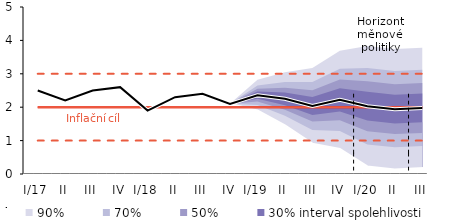
| Category | Inflation Target | Inflation Target - lower bound | Inflation Target - upper bound | linka | Střed předpovědi |
|---|---|---|---|---|---|
| I/17 | 2 | 1 | 3 | 2.5 | 2.5 |
| II | 2 | 1 | 3 | 2.2 | 2.2 |
| III | 2 | 1 | 3 | 2.5 | 2.5 |
| IV | 2 | 1 | 3 | 2.6 | 2.6 |
| I/18 | 2 | 1 | 3 | 1.9 | 1.9 |
| II | 2 | 1 | 3 | 2.3 | 2.3 |
| III | 2 | 1 | 3 | 2.4 | 2.4 |
| IV | 2 | 1 | 3 | 2.1 | 2.1 |
| I/19 | 2 | 1 | 3 | 2.359 | 2.359 |
| II | 2 | 1 | 3 | 2.251 | 2.251 |
| III | 2 | 1 | 3 | 2.039 | 2.039 |
| IV | 2 | 1 | 3 | 2.22 | 2.22 |
| I/20 | 2 | 1 | 3 | 2.031 | 2.031 |
| II | 2 | 1 | 3 | 1.942 | 1.942 |
| III | 2 | 1 | 3 | 1.979 | 1.979 |